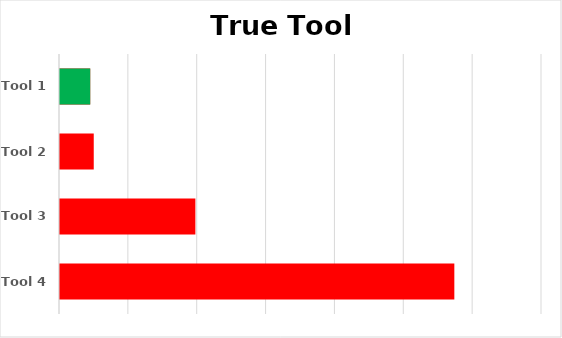
| Category | Series 0 | Max |
|---|---|---|
| Tool 1 | 0.022 | 0.022 |
| Tool 2 | 0.025 | 0 |
| Tool 3 | 0.098 | 0 |
| Tool 4 | 0.286 | 0 |